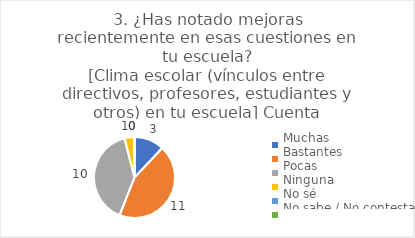
| Category | 3. ¿Has notado mejoras recientemente en esas cuestiones en tu escuela?
[Clima escolar (vínculos entre directivos, profesores, estudiantes y otros) en tu escuela] |
|---|---|
| Muchas  | 0.12 |
| Bastantes  | 0.44 |
| Pocas  | 0.4 |
| Ninguna  | 0.04 |
| No sé  | 0 |
| No sabe / No contesta | 0 |